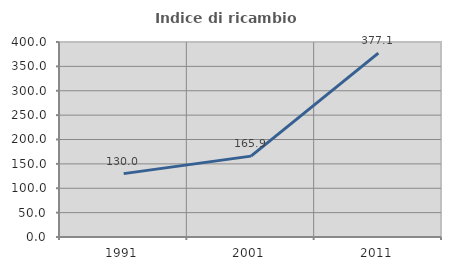
| Category | Indice di ricambio occupazionale  |
|---|---|
| 1991.0 | 130 |
| 2001.0 | 165.882 |
| 2011.0 | 377.083 |